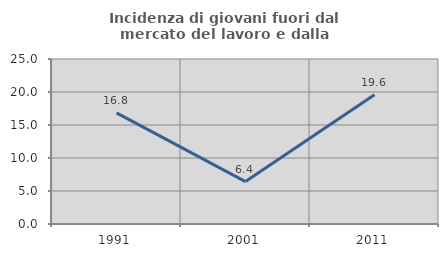
| Category | Incidenza di giovani fuori dal mercato del lavoro e dalla formazione  |
|---|---|
| 1991.0 | 16.838 |
| 2001.0 | 6.429 |
| 2011.0 | 19.588 |